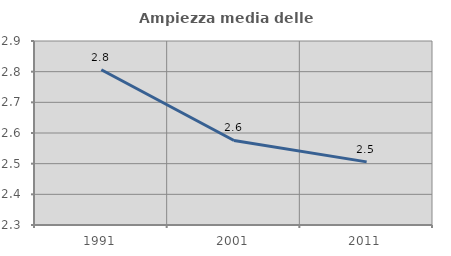
| Category | Ampiezza media delle famiglie |
|---|---|
| 1991.0 | 2.806 |
| 2001.0 | 2.576 |
| 2011.0 | 2.506 |